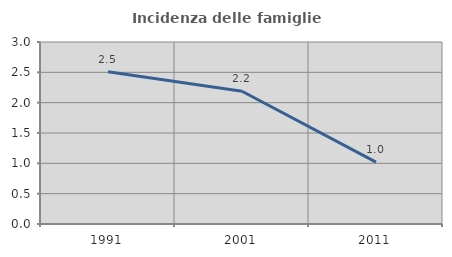
| Category | Incidenza delle famiglie numerose |
|---|---|
| 1991.0 | 2.51 |
| 2001.0 | 2.189 |
| 2011.0 | 1.019 |